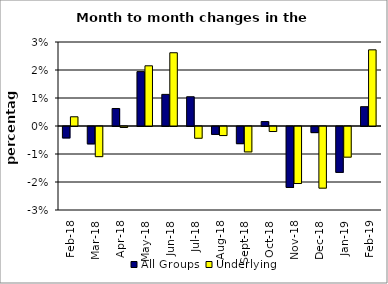
| Category | All Groups | Underlying |
|---|---|---|
| 2018-02-01 | -0.004 | 0.003 |
| 2018-03-01 | -0.006 | -0.011 |
| 2018-04-01 | 0.006 | 0 |
| 2018-05-01 | 0.019 | 0.021 |
| 2018-06-01 | 0.011 | 0.026 |
| 2018-07-01 | 0.01 | -0.004 |
| 2018-08-01 | -0.003 | -0.003 |
| 2018-09-01 | -0.006 | -0.009 |
| 2018-10-01 | 0.002 | -0.002 |
| 2018-11-01 | -0.022 | -0.02 |
| 2018-12-01 | -0.002 | -0.022 |
| 2019-01-01 | -0.016 | -0.011 |
| 2019-02-01 | 0.007 | 0.027 |